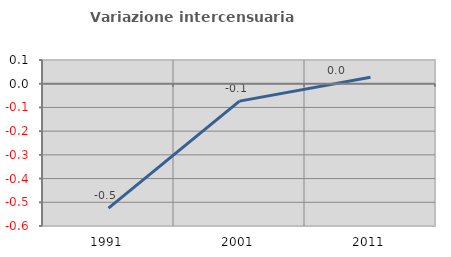
| Category | Variazione intercensuaria annua |
|---|---|
| 1991.0 | -0.525 |
| 2001.0 | -0.074 |
| 2011.0 | 0.028 |